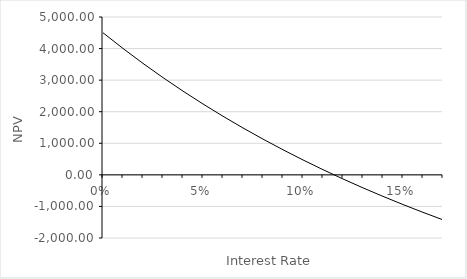
| Category | NPV |
|---|---|
| 0.0 | 4500 |
| 0.01 | 4002.778 |
| 0.02 | 3530.064 |
| 0.03 | 3080.371 |
| 0.04 | 2652.316 |
| 0.05 | 2244.614 |
| 0.060000000000000005 | 1856.068 |
| 0.07 | 1485.565 |
| 0.08 | 1132.067 |
| 0.09 | 794.604 |
| 0.09999999999999999 | 472.273 |
| 0.10999999999999999 | 164.23 |
| 0.11999999999999998 | -130.314 |
| 0.12999999999999998 | -412.097 |
| 0.13999999999999999 | -681.809 |
| 0.15 | -940.098 |
| 0.16 | -1187.568 |
| 0.17 | -1424.788 |